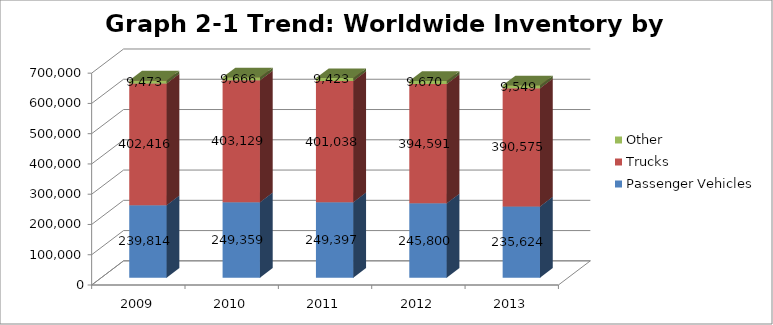
| Category | Passenger Vehicles | Trucks | Other |
|---|---|---|---|
| 2009.0 | 239814 | 402416 | 9473 |
| 2010.0 | 249359 | 403129 | 9666 |
| 2011.0 | 249397 | 401038 | 9423 |
| 2012.0 | 245800 | 394591 | 9670 |
| 2013.0 | 235624 | 390575 | 9549 |